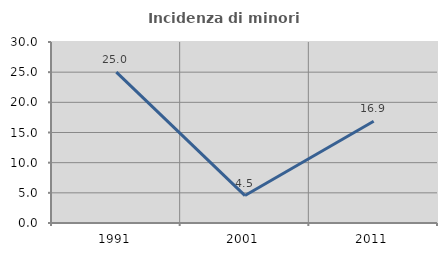
| Category | Incidenza di minori stranieri |
|---|---|
| 1991.0 | 25 |
| 2001.0 | 4.545 |
| 2011.0 | 16.854 |